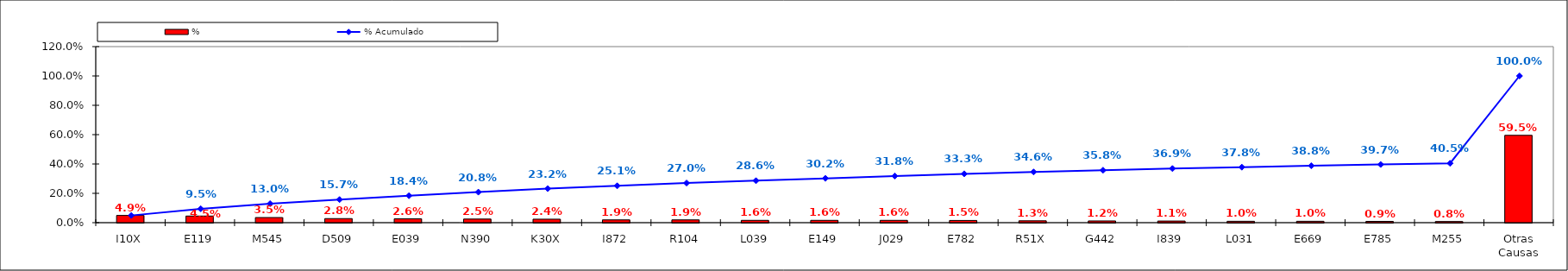
| Category | % |
|---|---|
| I10X | 0.049 |
| E119 | 0.045 |
| M545 | 0.035 |
| D509 | 0.028 |
| E039 | 0.026 |
| N390 | 0.025 |
| K30X | 0.024 |
| I872 | 0.019 |
| R104 | 0.019 |
| L039 | 0.016 |
| E149 | 0.016 |
| J029 | 0.016 |
| E782 | 0.015 |
| R51X | 0.013 |
| G442 | 0.012 |
| I839 | 0.011 |
| L031 | 0.01 |
| E669 | 0.01 |
| E785 | 0.009 |
| M255 | 0.008 |
| Otras Causas | 0.595 |